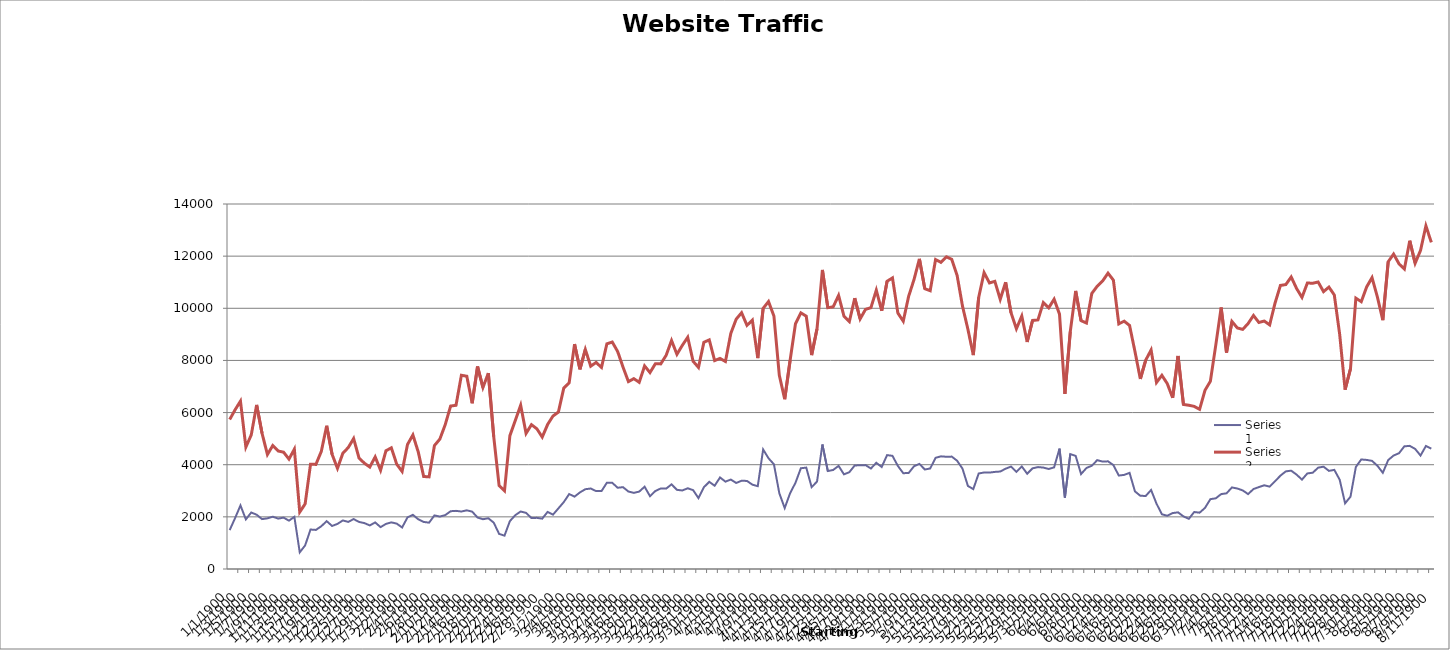
| Category | Series 0 | Series 1 |
|---|---|---|
| 0 | 1493 | 5734 |
| 1/1/00 | 1952 | 6106 |
| 1/2/00 | 2439 | 6439 |
| 1/3/00 | 1903 | 4676 |
| 1/4/00 | 2167 | 5143 |
| 1/5/00 | 2082 | 6294 |
| 1/6/00 | 1914 | 5209 |
| 1/7/00 | 1943 | 4392 |
| 1/8/00 | 2005 | 4737 |
| 1/9/00 | 1933 | 4525 |
| 1/10/00 | 1970 | 4481 |
| 1/11/00 | 1854 | 4216 |
| 1/12/00 | 2002 | 4596 |
| 1/13/00 | 640 | 2183 |
| 1/14/00 | 905 | 2497 |
| 1/15/00 | 1514 | 4018 |
| 1/16/00 | 1499 | 4012 |
| 1/17/00 | 1640 | 4509 |
| 1/18/00 | 1835 | 5494 |
| 1/19/00 | 1651 | 4400 |
| 1/20/00 | 1730 | 3861 |
| 1/21/00 | 1863 | 4440 |
| 1/22/00 | 1806 | 4658 |
| 1/23/00 | 1915 | 5004 |
| 1/24/00 | 1805 | 4257 |
| 1/25/00 | 1761 | 4057 |
| 1/26/00 | 1671 | 3911 |
| 1/27/00 | 1787 | 4299 |
| 1/28/00 | 1606 | 3788 |
| 1/29/00 | 1730 | 4536 |
| 1/30/00 | 1789 | 4648 |
| 1/31/00 | 1740 | 4018 |
| 2/1/00 | 1593 | 3741 |
| 2/2/00 | 1980 | 4777 |
| 2/3/00 | 2077 | 5142 |
| 2/4/00 | 1906 | 4484 |
| 2/5/00 | 1805 | 3548 |
| 2/6/00 | 1778 | 3534 |
| 2/7/00 | 2055 | 4736 |
| 2/8/00 | 2011 | 4982 |
| 2/9/00 | 2067 | 5537 |
| 2/10/00 | 2216 | 6250 |
| 2/11/00 | 2230 | 6280 |
| 2/12/00 | 2205 | 7431 |
| 2/13/00 | 2250 | 7394 |
| 2/14/00 | 2201 | 6355 |
| 2/15/00 | 1973 | 7766 |
| 2/16/00 | 1910 | 6962 |
| 2/17/00 | 1946 | 7514 |
| 2/18/00 | 1778 | 5080 |
| 2/19/00 | 1346 | 3199 |
| 2/20/00 | 1280 | 2998 |
| 2/21/00 | 1838 | 5113 |
| 2/22/00 | 2065 | 5696 |
| 2/23/00 | 2205 | 6285 |
| 2/24/00 | 2153 | 5203 |
| 2/25/00 | 1955 | 5538 |
| 2/26/00 | 1962 | 5378 |
| 2/27/00 | 1931 | 5057 |
| 2/28/00 | 2190 | 5541 |
| 2/28/00 | 2085 | 5870 |
| 3/1/00 | 2325 | 6021 |
| 3/2/00 | 2566 | 6939 |
| 3/3/00 | 2875 | 7142 |
| 3/4/00 | 2776 | 8627 |
| 3/5/00 | 2938 | 7658 |
| 3/6/00 | 3060 | 8419 |
| 3/7/00 | 3087 | 7779 |
| 3/8/00 | 2988 | 7923 |
| 3/9/00 | 2987 | 7732 |
| 3/10/00 | 3310 | 8638 |
| 3/11/00 | 3305 | 8706 |
| 3/12/00 | 3117 | 8341 |
| 3/13/00 | 3138 | 7740 |
| 3/14/00 | 2971 | 7188 |
| 3/15/00 | 2920 | 7301 |
| 3/16/00 | 2969 | 7161 |
| 3/17/00 | 3156 | 7789 |
| 3/18/00 | 2794 | 7534 |
| 3/19/00 | 2992 | 7874 |
| 3/20/00 | 3089 | 7867 |
| 3/21/00 | 3083 | 8198 |
| 3/22/00 | 3247 | 8764 |
| 3/23/00 | 3036 | 8235 |
| 3/24/00 | 3012 | 8579 |
| 3/25/00 | 3096 | 8890 |
| 3/26/00 | 3026 | 7968 |
| 3/27/00 | 2718 | 7731 |
| 3/28/00 | 3137 | 8696 |
| 3/29/00 | 3343 | 8788 |
| 3/30/00 | 3195 | 7995 |
| 3/31/00 | 3512 | 8077 |
| 4/1/00 | 3351 | 7959 |
| 4/2/00 | 3431 | 9037 |
| 4/3/00 | 3300 | 9583 |
| 4/4/00 | 3385 | 9830 |
| 4/5/00 | 3378 | 9345 |
| 4/6/00 | 3235 | 9544 |
| 4/7/00 | 3177 | 8090 |
| 4/8/00 | 4585 | 9994 |
| 4/9/00 | 4246 | 10256 |
| 4/10/00 | 4017 | 9705 |
| 4/11/00 | 2907 | 7430 |
| 4/12/00 | 2337 | 6514 |
| 4/13/00 | 2906 | 7998 |
| 4/14/00 | 3307 | 9406 |
| 4/15/00 | 3865 | 9826 |
| 4/16/00 | 3889 | 9695 |
| 4/17/00 | 3140 | 8204 |
| 4/18/00 | 3354 | 9216 |
| 4/19/00 | 4776 | 11471 |
| 4/20/00 | 3758 | 10023 |
| 4/21/00 | 3799 | 10055 |
| 4/22/00 | 3956 | 10494 |
| 4/23/00 | 3630 | 9697 |
| 4/24/00 | 3714 | 9493 |
| 4/25/00 | 3973 | 10389 |
| 4/26/00 | 3977 | 9592 |
| 4/27/00 | 3985 | 9960 |
| 4/28/00 | 3855 | 10022 |
| 4/29/00 | 4073 | 10695 |
| 4/30/00 | 3913 | 9904 |
| 5/1/00 | 4368 | 11037 |
| 5/2/00 | 4340 | 11165 |
| 5/3/00 | 3954 | 9819 |
| 5/4/00 | 3675 | 9505 |
| 5/5/00 | 3682 | 10458 |
| 5/6/00 | 3941 | 11103 |
| 5/7/00 | 4032 | 11895 |
| 5/8/00 | 3817 | 10751 |
| 5/9/00 | 3855 | 10674 |
| 5/10/00 | 4265 | 11870 |
| 5/11/00 | 4321 | 11761 |
| 5/12/00 | 4305 | 11975 |
| 5/13/00 | 4311 | 11878 |
| 5/14/00 | 4153 | 11258 |
| 5/15/00 | 3846 | 10079 |
| 5/16/00 | 3186 | 9196 |
| 5/17/00 | 3064 | 8205 |
| 5/18/00 | 3663 | 10419 |
| 5/19/00 | 3702 | 11366 |
| 5/20/00 | 3698 | 10968 |
| 5/21/00 | 3724 | 11035 |
| 5/22/00 | 3739 | 10345 |
| 5/23/00 | 3847 | 10996 |
| 5/24/00 | 3928 | 9833 |
| 5/25/00 | 3728 | 9212 |
| 5/26/00 | 3933 | 9703 |
| 5/27/00 | 3655 | 8707 |
| 5/28/00 | 3861 | 9536 |
| 5/29/00 | 3909 | 9555 |
| 5/30/00 | 3890 | 10217 |
| 5/31/00 | 3836 | 10016 |
| 6/1/00 | 3899 | 10349 |
| 6/2/00 | 4618 | 9774 |
| 6/3/00 | 2736 | 6716 |
| 6/4/00 | 4408 | 9107 |
| 6/5/00 | 4337 | 10667 |
| 6/6/00 | 3642 | 9526 |
| 6/7/00 | 3874 | 9434 |
| 6/8/00 | 3962 | 10573 |
| 6/9/00 | 4175 | 10847 |
| 6/10/00 | 4120 | 11046 |
| 6/11/00 | 4130 | 11348 |
| 6/12/00 | 3986 | 11080 |
| 6/13/00 | 3584 | 9402 |
| 6/14/00 | 3610 | 9506 |
| 6/15/00 | 3687 | 9342 |
| 6/16/00 | 2978 | 8346 |
| 6/17/00 | 2808 | 7289 |
| 6/18/00 | 2802 | 8011 |
| 6/19/00 | 3030 | 8402 |
| 6/20/00 | 2507 | 7152 |
| 6/21/00 | 2099 | 7429 |
| 6/22/00 | 2042 | 7110 |
| 6/23/00 | 2145 | 6565 |
| 6/24/00 | 2173 | 8170 |
| 6/25/00 | 2018 | 6309 |
| 6/26/00 | 1925 | 6277 |
| 6/27/00 | 2186 | 6238 |
| 6/28/00 | 2160 | 6125 |
| 6/29/00 | 2344 | 6856 |
| 6/30/00 | 2679 | 7202 |
| 7/1/00 | 2711 | 8588 |
| 7/2/00 | 2873 | 10031 |
| 7/3/00 | 2903 | 8301 |
| 7/4/00 | 3128 | 9495 |
| 7/5/00 | 3087 | 9247 |
| 7/6/00 | 3015 | 9190 |
| 7/7/00 | 2873 | 9415 |
| 7/8/00 | 3067 | 9724 |
| 7/9/00 | 3142 | 9456 |
| 7/10/00 | 3211 | 9511 |
| 7/11/00 | 3160 | 9363 |
| 7/12/00 | 3365 | 10200 |
| 7/13/00 | 3581 | 10877 |
| 7/14/00 | 3745 | 10910 |
| 7/15/00 | 3772 | 11201 |
| 7/16/00 | 3619 | 10758 |
| 7/17/00 | 3429 | 10418 |
| 7/18/00 | 3666 | 10969 |
| 7/19/00 | 3693 | 10961 |
| 7/20/00 | 3887 | 11008 |
| 7/21/00 | 3925 | 10639 |
| 7/22/00 | 3764 | 10813 |
| 7/23/00 | 3802 | 10510 |
| 7/24/00 | 3423 | 8992 |
| 7/25/00 | 2519 | 6876 |
| 7/26/00 | 2773 | 7677 |
| 7/27/00 | 3915 | 10390 |
| 7/28/00 | 4202 | 10254 |
| 7/29/00 | 4184 | 10816 |
| 7/30/00 | 4148 | 11173 |
| 7/31/00 | 3960 | 10431 |
| 8/1/00 | 3690 | 9542 |
| 8/2/00 | 4178 | 11787 |
| 8/3/00 | 4352 | 12078 |
| 8/4/00 | 4440 | 11705 |
| 8/5/00 | 4705 | 11509 |
| 8/6/00 | 4723 | 12593 |
| 8/7/00 | 4606 | 11728 |
| 8/8/00 | 4352 | 12219 |
| 8/9/00 | 4718 | 13163 |
| 8/10/00 | 4615 | 12530 |